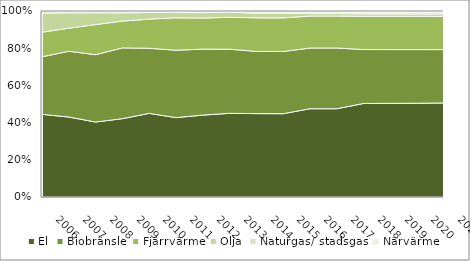
| Category | El | Biobränsle | Fjärrvärme | Olja | Naturgas/ stadsgas | Närvärme |
|---|---|---|---|---|---|---|
| 2006 | 0.447 | 0.311 | 0.133 | 0.103 | 0.009 | 0.003 |
| 2007 | 0.43 | 0.354 | 0.124 | 0.083 | 0.006 | 0.003 |
| 2008 | 0.403 | 0.362 | 0.162 | 0.063 | 0.006 | 0.003 |
| 2009 | 0.421 | 0.381 | 0.144 | 0.044 | 0.006 | 0.004 |
| 2010 | 0.45 | 0.35 | 0.157 | 0.036 | 0.006 | 0.002 |
| 2011 | 0.427 | 0.362 | 0.174 | 0.028 | 0.004 | 0.005 |
| 2012 | 0.44 | 0.355 | 0.167 | 0.029 | 0.005 | 0.004 |
| 2013 | 0.45 | 0.345 | 0.172 | 0.028 | 0.003 | 0.003 |
| 2014 | 0.448 | 0.335 | 0.18 | 0.024 | 0.008 | 0.005 |
| 2015 | 0.448 | 0.335 | 0.181 | 0.024 | 0.008 | 0.005 |
| 2016 | 0.475 | 0.326 | 0.172 | 0.013 | 0.008 | 0.006 |
| 2017 | 0.475 | 0.326 | 0.172 | 0.013 | 0.008 | 0.006 |
| 2018 | 0.503 | 0.29 | 0.179 | 0.013 | 0.009 | 0.007 |
| 2019 | 0.503 | 0.289 | 0.179 | 0.013 | 0.009 | 0.007 |
| 2020 | 0.504 | 0.289 | 0.179 | 0.013 | 0.009 | 0.007 |
| 2021 | 0.506 | 0.287 | 0.179 | 0.013 | 0.009 | 0.007 |